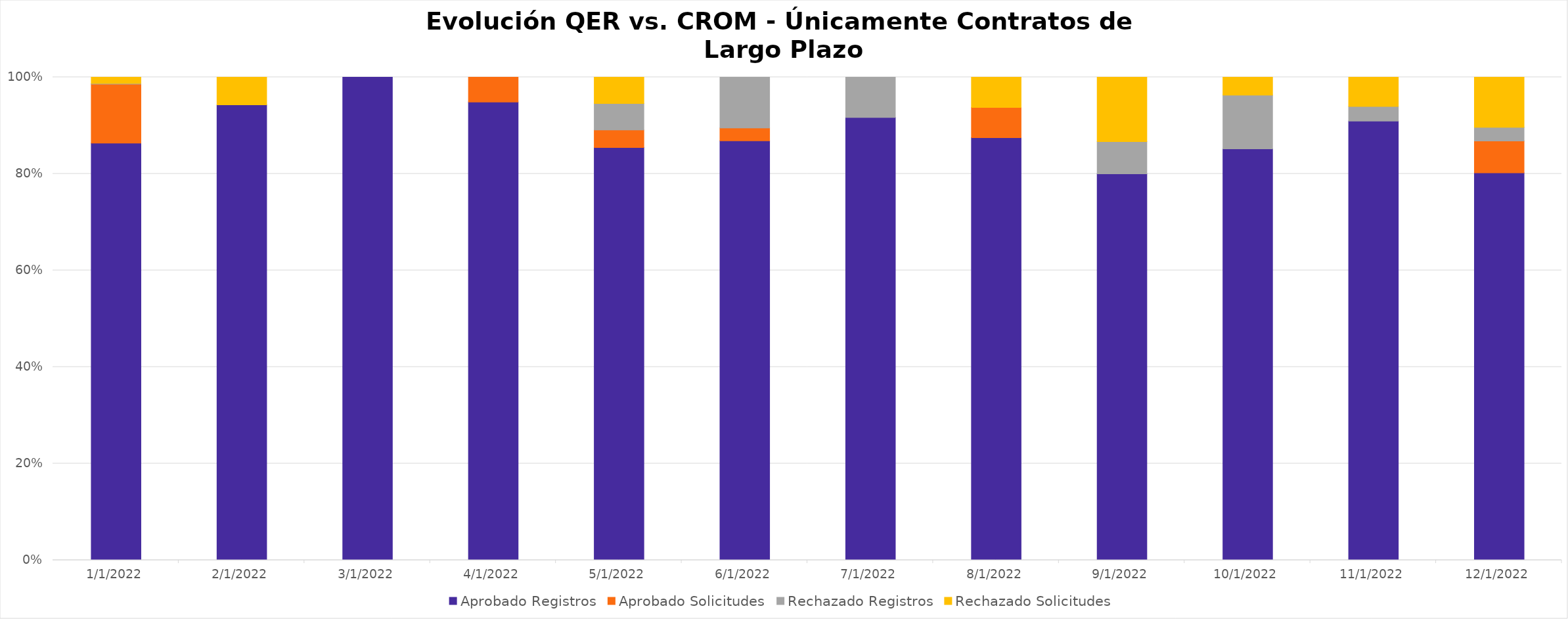
| Category | Aprobado Registros | Aprobado Solicitudes | Rechazado Registros | Rechazado Solicitudes |
|---|---|---|---|---|
| 1/1/22 | 0.864 | 0.122 | 0.001 | 0.013 |
| 2/1/22 | 0.943 | 0 | 0 | 0.057 |
| 3/1/22 | 1 | 0 | 0 | 0 |
| 4/1/22 | 0.949 | 0.051 | 0 | 0 |
| 5/1/22 | 0.855 | 0.036 | 0.055 | 0.055 |
| 6/1/22 | 0.868 | 0.026 | 0.105 | 0 |
| 7/1/22 | 0.917 | 0 | 0.083 | 0 |
| 8/1/22 | 0.875 | 0.062 | 0 | 0.062 |
| 9/1/22 | 0.8 | 0 | 0.067 | 0.133 |
| 10/1/22 | 0.852 | 0 | 0.111 | 0.037 |
| 11/1/22 | 0.909 | 0 | 0.03 | 0.061 |
| 12/1/22 | 0.802 | 0.066 | 0.028 | 0.104 |